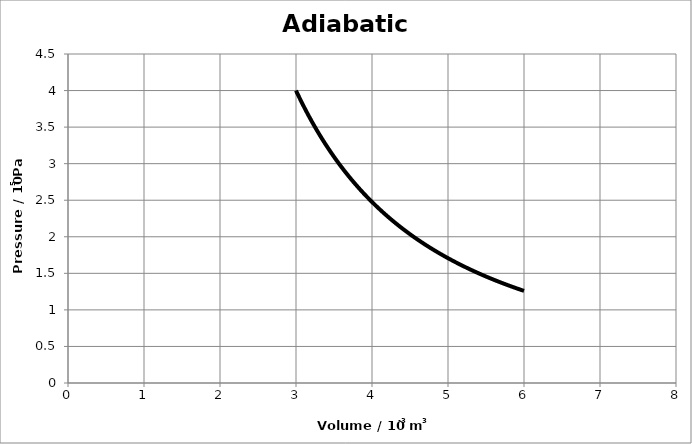
| Category | Series 0 |
|---|---|
| 3.0 | 4 |
| 3.03 | 3.934 |
| 3.0599999999999996 | 3.87 |
| 3.0899999999999994 | 3.808 |
| 3.119999999999999 | 3.747 |
| 3.149999999999999 | 3.688 |
| 3.179999999999999 | 3.63 |
| 3.2099999999999986 | 3.573 |
| 3.2399999999999984 | 3.518 |
| 3.2699999999999982 | 3.465 |
| 3.299999999999998 | 3.412 |
| 3.329999999999998 | 3.361 |
| 3.3599999999999977 | 3.312 |
| 3.3899999999999975 | 3.263 |
| 3.4199999999999973 | 3.215 |
| 3.449999999999997 | 3.169 |
| 3.479999999999997 | 3.123 |
| 3.5099999999999967 | 3.079 |
| 3.5399999999999965 | 3.036 |
| 3.5699999999999963 | 2.993 |
| 3.599999999999996 | 2.952 |
| 3.629999999999996 | 2.911 |
| 3.6599999999999957 | 2.872 |
| 3.6899999999999955 | 2.833 |
| 3.7199999999999953 | 2.795 |
| 3.749999999999995 | 2.758 |
| 3.779999999999995 | 2.721 |
| 3.8099999999999947 | 2.686 |
| 3.8399999999999945 | 2.651 |
| 3.8699999999999943 | 2.617 |
| 3.899999999999994 | 2.583 |
| 3.929999999999994 | 2.55 |
| 3.9599999999999937 | 2.518 |
| 3.9899999999999936 | 2.487 |
| 4.019999999999993 | 2.456 |
| 4.049999999999994 | 2.426 |
| 4.079999999999994 | 2.396 |
| 4.109999999999994 | 2.367 |
| 4.139999999999994 | 2.338 |
| 4.169999999999995 | 2.31 |
| 4.199999999999995 | 2.283 |
| 4.229999999999995 | 2.256 |
| 4.259999999999995 | 2.23 |
| 4.289999999999996 | 2.204 |
| 4.319999999999996 | 2.178 |
| 4.349999999999996 | 2.153 |
| 4.379999999999996 | 2.129 |
| 4.409999999999997 | 2.105 |
| 4.439999999999997 | 2.081 |
| 4.469999999999997 | 2.058 |
| 4.499999999999997 | 2.035 |
| 4.529999999999998 | 2.013 |
| 4.559999999999998 | 1.991 |
| 4.589999999999998 | 1.969 |
| 4.619999999999998 | 1.948 |
| 4.649999999999999 | 1.927 |
| 4.679999999999999 | 1.906 |
| 4.709999999999999 | 1.886 |
| 4.739999999999999 | 1.866 |
| 4.77 | 1.847 |
| 4.8 | 1.828 |
| 4.83 | 1.809 |
| 4.86 | 1.79 |
| 4.890000000000001 | 1.772 |
| 4.920000000000001 | 1.754 |
| 4.950000000000001 | 1.736 |
| 4.980000000000001 | 1.719 |
| 5.010000000000002 | 1.702 |
| 5.040000000000002 | 1.685 |
| 5.070000000000002 | 1.668 |
| 5.100000000000002 | 1.652 |
| 5.130000000000003 | 1.636 |
| 5.160000000000003 | 1.62 |
| 5.190000000000003 | 1.604 |
| 5.220000000000003 | 1.589 |
| 5.2500000000000036 | 1.574 |
| 5.280000000000004 | 1.559 |
| 5.310000000000004 | 1.544 |
| 5.340000000000004 | 1.53 |
| 5.3700000000000045 | 1.516 |
| 5.400000000000005 | 1.502 |
| 5.430000000000005 | 1.488 |
| 5.460000000000005 | 1.474 |
| 5.4900000000000055 | 1.461 |
| 5.520000000000006 | 1.448 |
| 5.550000000000006 | 1.435 |
| 5.580000000000006 | 1.422 |
| 5.6100000000000065 | 1.409 |
| 5.640000000000007 | 1.397 |
| 5.670000000000007 | 1.384 |
| 5.700000000000007 | 1.372 |
| 5.7300000000000075 | 1.36 |
| 5.760000000000008 | 1.349 |
| 5.790000000000008 | 1.337 |
| 5.820000000000008 | 1.326 |
| 5.8500000000000085 | 1.314 |
| 5.880000000000009 | 1.303 |
| 5.910000000000009 | 1.292 |
| 5.940000000000009 | 1.281 |
| 5.9700000000000095 | 1.27 |
| 6.00000000000001 | 1.26 |